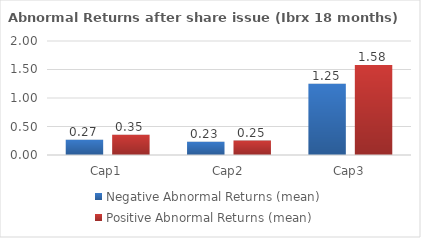
| Category | Negative Abnormal Returns (mean) | Positive Abnormal Returns (mean) |
|---|---|---|
| Cap1 | 0.267 | 0.355 |
| Cap2 | 0.231 | 0.254 |
| Cap3 | 1.249 | 1.581 |